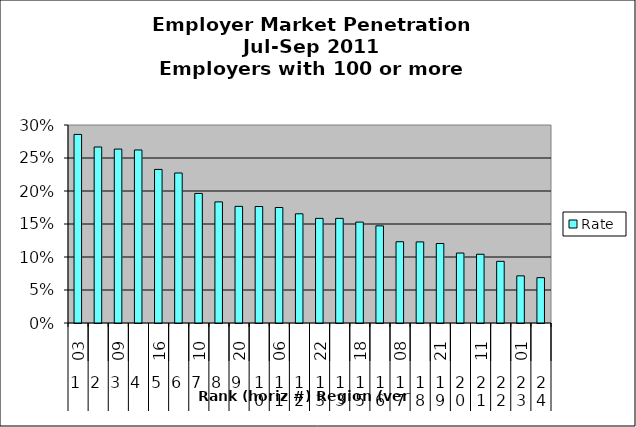
| Category | Rate |
|---|---|
| 0 | 0.286 |
| 1 | 0.267 |
| 2 | 0.264 |
| 3 | 0.262 |
| 4 | 0.233 |
| 5 | 0.227 |
| 6 | 0.196 |
| 7 | 0.184 |
| 8 | 0.177 |
| 9 | 0.176 |
| 10 | 0.175 |
| 11 | 0.165 |
| 12 | 0.159 |
| 13 | 0.159 |
| 14 | 0.153 |
| 15 | 0.147 |
| 16 | 0.123 |
| 17 | 0.123 |
| 18 | 0.12 |
| 19 | 0.106 |
| 20 | 0.104 |
| 21 | 0.093 |
| 22 | 0.071 |
| 23 | 0.069 |